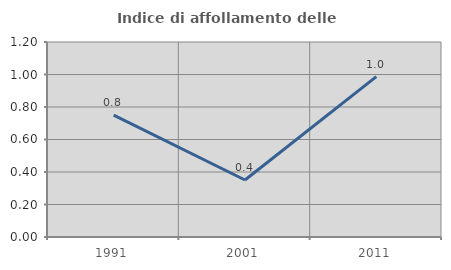
| Category | Indice di affollamento delle abitazioni  |
|---|---|
| 1991.0 | 0.75 |
| 2001.0 | 0.351 |
| 2011.0 | 0.987 |